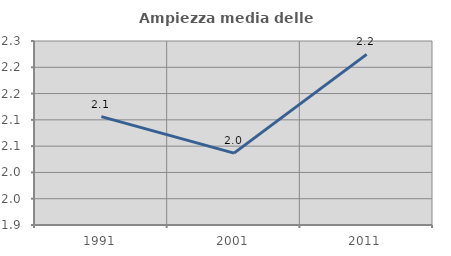
| Category | Ampiezza media delle famiglie |
|---|---|
| 1991.0 | 2.106 |
| 2001.0 | 2.037 |
| 2011.0 | 2.224 |